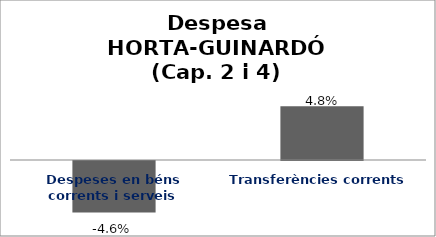
| Category | Series 0 |
|---|---|
| Despeses en béns corrents i serveis | -0.046 |
| Transferències corrents | 0.048 |